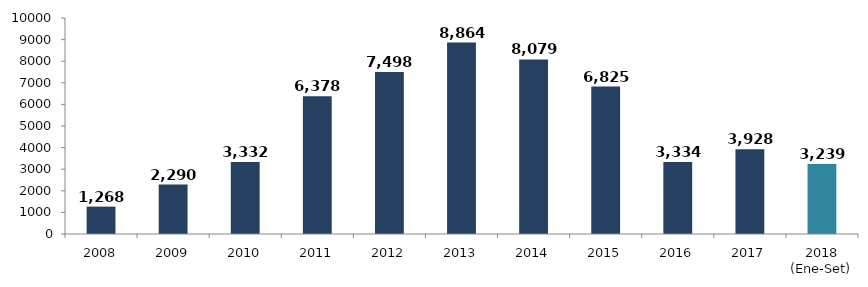
| Category | Series 0 |
|---|---|
| 2008 | 1267.813 |
| 2009 | 2290.273 |
| 2010 | 3331.554 |
| 2011 | 6377.615 |
| 2012 | 7498.207 |
| 2013 | 8863.622 |
| 2014 | 8079.21 |
| 2015 | 6824.624 |
| 2016 | 3333.564 |
| 2017 | 3928.017 |
| 2018 (Ene-Set) | 3239.12 |